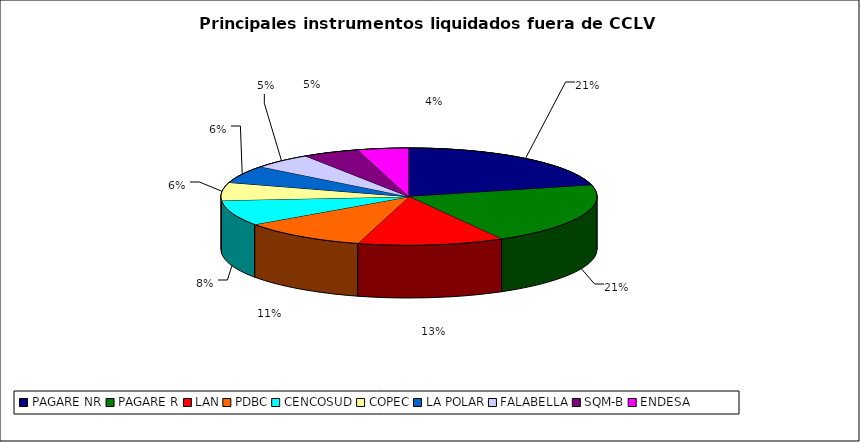
| Category | Series 0 |
|---|---|
| PAGARE NR | 1322 |
| PAGARE R | 1277 |
| LAN | 782 |
| PDBC | 679 |
| CENCOSUD | 527 |
| COPEC | 369 |
| LA POLAR | 363 |
| FALABELLA | 322 |
| SQM-B | 302 |
| ENDESA | 274 |